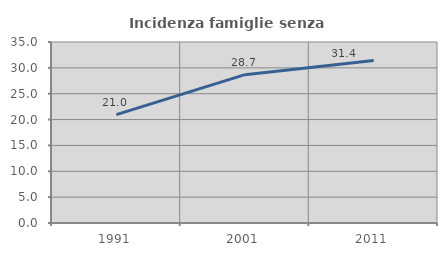
| Category | Incidenza famiglie senza nuclei |
|---|---|
| 1991.0 | 20.959 |
| 2001.0 | 28.68 |
| 2011.0 | 31.414 |